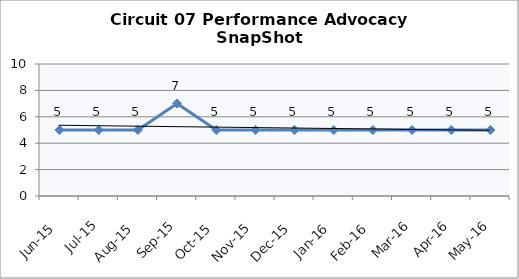
| Category | Circuit 07 |
|---|---|
| Jun-15 | 5 |
| Jul-15 | 5 |
| Aug-15 | 5 |
| Sep-15 | 7 |
| Oct-15 | 5 |
| Nov-15 | 5 |
| Dec-15 | 5 |
| Jan-16 | 5 |
| Feb-16 | 5 |
| Mar-16 | 5 |
| Apr-16 | 5 |
| May-16 | 5 |